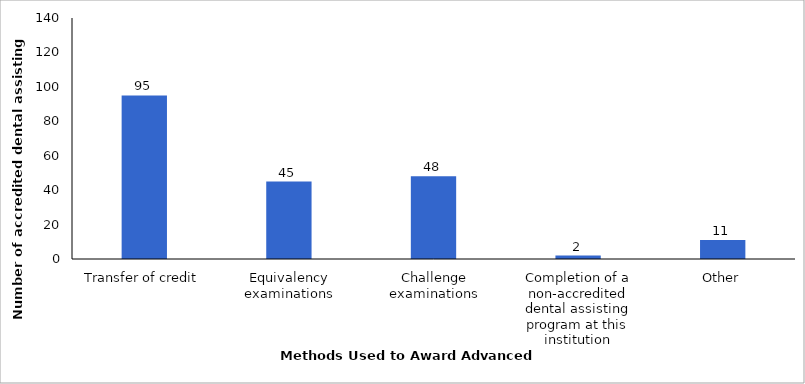
| Category | 2014-15 |
|---|---|
| Transfer of credit | 95 |
| Equivalency examinations | 45 |
| Challenge examinations | 48 |
| Completion of a non-accredited dental assisting program at this institution | 2 |
| Other | 11 |